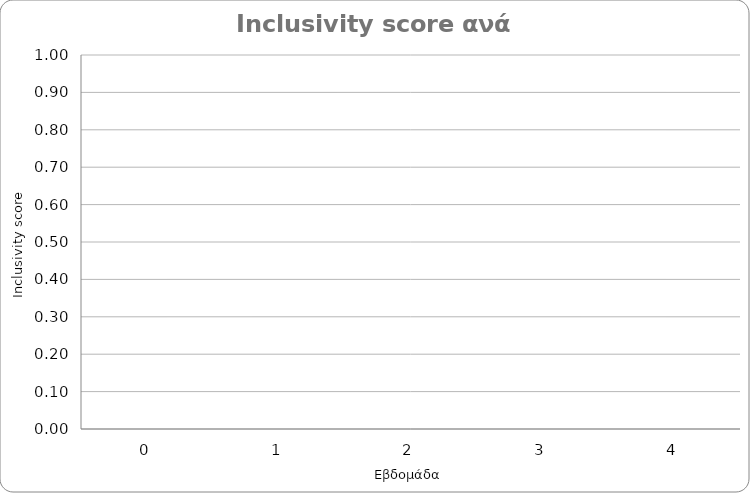
| Category | Inclusivity Mean Score |
|---|---|
| 0 | 0 |
| 1 | 0 |
| 2 | 0 |
| 3 | 0 |
| 4 | 0 |